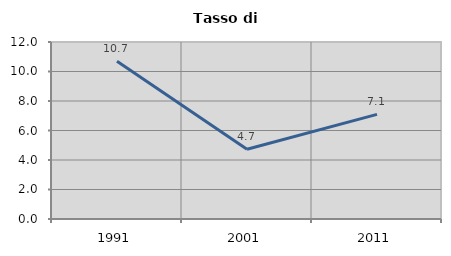
| Category | Tasso di disoccupazione   |
|---|---|
| 1991.0 | 10.696 |
| 2001.0 | 4.73 |
| 2011.0 | 7.09 |